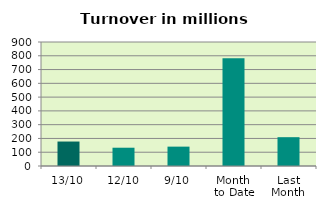
| Category | Series 0 |
|---|---|
| 13/10 | 177.564 |
| 12/10 | 132.693 |
| 9/10 | 140.55 |
| Month 
to Date | 781.726 |
| Last
Month | 209.117 |